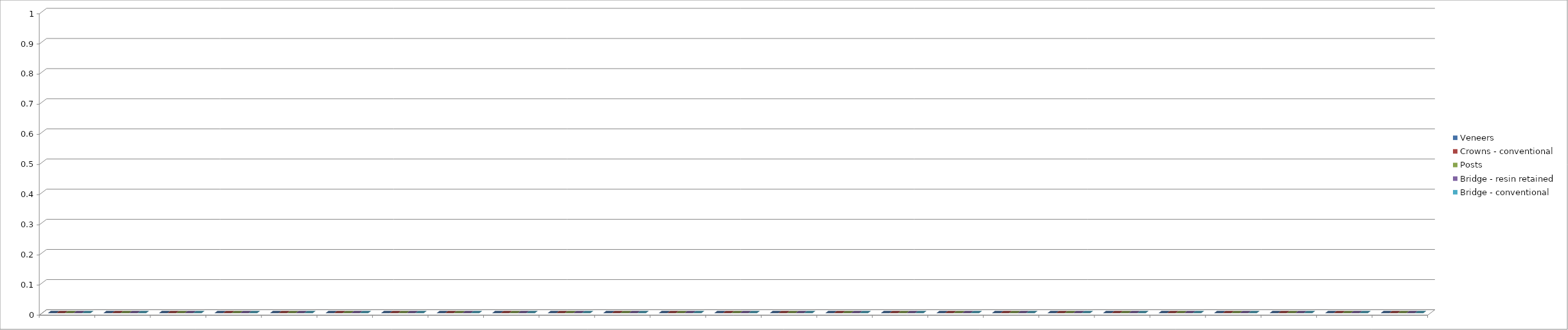
| Category | Veneers | Crowns - conventional | Posts | Bridge - resin retained | Bridge - conventional |
|---|---|---|---|---|---|
| 0 | 0 | 0 | 0 | 0 | 0 |
| 1 | 0 | 0 | 0 | 0 | 0 |
| 2 | 0 | 0 | 0 | 0 | 0 |
| 3 | 0 | 0 | 0 | 0 | 0 |
| 4 | 0 | 0 | 0 | 0 | 0 |
| 5 | 0 | 0 | 0 | 0 | 0 |
| 6 | 0 | 0 | 0 | 0 | 0 |
| 7 | 0 | 0 | 0 | 0 | 0 |
| 8 | 0 | 0 | 0 | 0 | 0 |
| 9 | 0 | 0 | 0 | 0 | 0 |
| 10 | 0 | 0 | 0 | 0 | 0 |
| 11 | 0 | 0 | 0 | 0 | 0 |
| 12 | 0 | 0 | 0 | 0 | 0 |
| 13 | 0 | 0 | 0 | 0 | 0 |
| 14 | 0 | 0 | 0 | 0 | 0 |
| 15 | 0 | 0 | 0 | 0 | 0 |
| 16 | 0 | 0 | 0 | 0 | 0 |
| 17 | 0 | 0 | 0 | 0 | 0 |
| 18 | 0 | 0 | 0 | 0 | 0 |
| 19 | 0 | 0 | 0 | 0 | 0 |
| 20 | 0 | 0 | 0 | 0 | 0 |
| 21 | 0 | 0 | 0 | 0 | 0 |
| 22 | 0 | 0 | 0 | 0 | 0 |
| 23 | 0 | 0 | 0 | 0 | 0 |
| 24 | 0 | 0 | 0 | 0 | 0 |